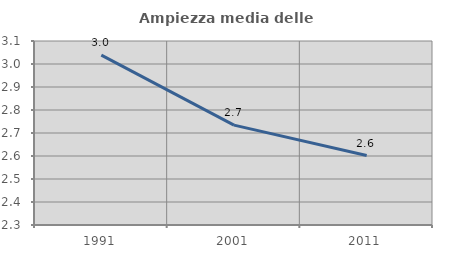
| Category | Ampiezza media delle famiglie |
|---|---|
| 1991.0 | 3.039 |
| 2001.0 | 2.734 |
| 2011.0 | 2.602 |